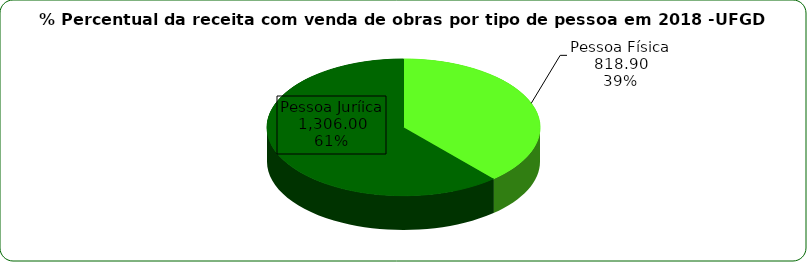
| Category | Series 0 |
|---|---|
| Pessoa Física | 818.9 |
| Pessoa Juríica | 1306 |